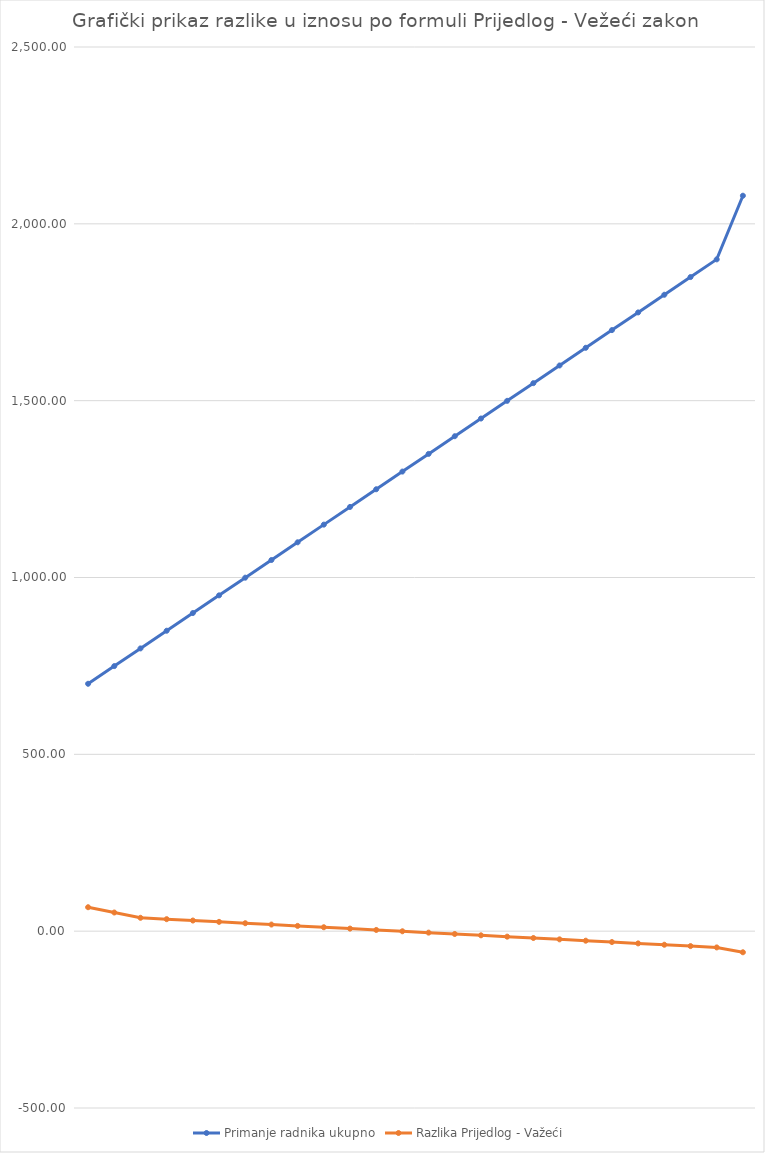
| Category | Primanje radnika ukupno | Razlika Prijedlog - Važeći |
|---|---|---|
| 0 | 699.5 | 67.69 |
| 1 | 749.5 | 52.75 |
| 2 | 799.5 | 37.8 |
| 3 | 849.5 | 33.91 |
| 4 | 899.5 | 30.09 |
| 5 | 949.5 | 26.31 |
| 6 | 999.5 | 22.48 |
| 7 | 1049.5 | 18.7 |
| 8 | 1099.5 | 14.89 |
| 9 | 1149.5 | 11.09 |
| 10 | 1199.5 | 7.27 |
| 11 | 1249.5 | 3.46 |
| 12 | 1299.5 | -0.32 |
| 13 | 1349.5 | -4.14 |
| 14 | 1399.5 | -7.93 |
| 15 | 1449.5 | -11.74 |
| 16 | 1499.5 | -15.54 |
| 17 | 1549.5 | -19.34 |
| 18 | 1599.5 | -23.15 |
| 19 | 1649.5 | -26.95 |
| 20 | 1699.5 | -30.77 |
| 21 | 1749.5 | -34.56 |
| 22 | 1799.5 | -38.36 |
| 23 | 1849.5 | -42.17 |
| 24 | 1899.5 | -45.97 |
| 25 | 2079.5 | -59.67 |